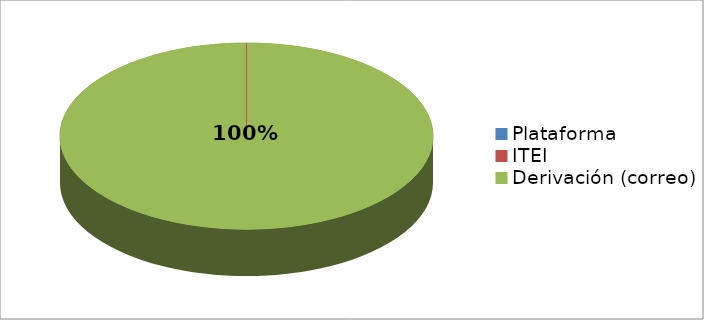
| Category | Series 0 | Series 1 |
|---|---|---|
| Plataforma | 0 | 0 |
| ITEI | 0 | 0 |
| Derivación (correo) | 1 | 1 |